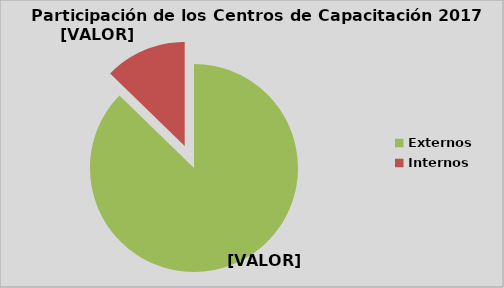
| Category | Series 0 |
|---|---|
| Externos | 87.273 |
| Internos | 12.727 |